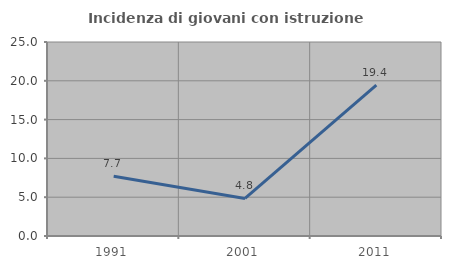
| Category | Incidenza di giovani con istruzione universitaria |
|---|---|
| 1991.0 | 7.692 |
| 2001.0 | 4.839 |
| 2011.0 | 19.444 |